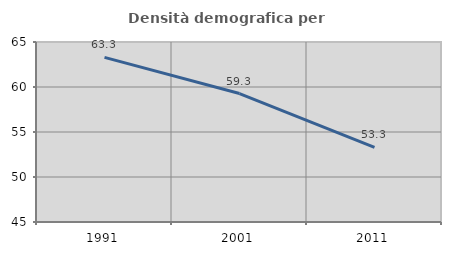
| Category | Densità demografica |
|---|---|
| 1991.0 | 63.289 |
| 2001.0 | 59.271 |
| 2011.0 | 53.289 |